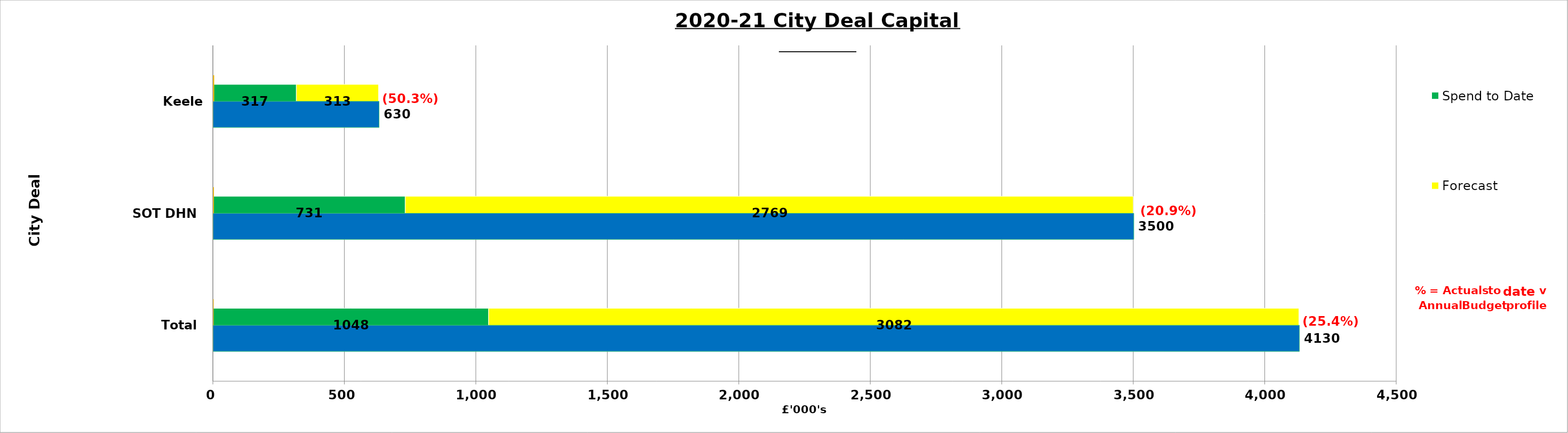
| Category | Spend to Date | Forecast |
|---|---|---|
| Total | 1048 | 3082 |
| SOT DHN | 731 | 2769 |
| Keele SEND | 317 | 313 |